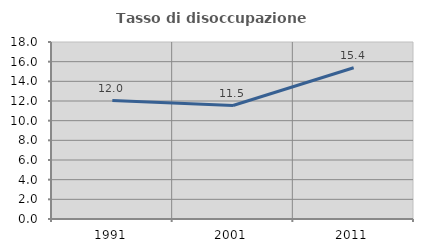
| Category | Tasso di disoccupazione giovanile  |
|---|---|
| 1991.0 | 12.048 |
| 2001.0 | 11.538 |
| 2011.0 | 15.385 |